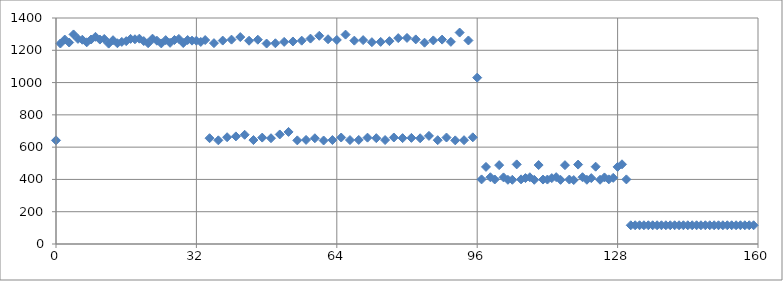
| Category | avg |
|---|---|
| 0.0 | 642.2 |
| 1.0 | 1242 |
| 2.0 | 1266.6 |
| 3.0 | 1248.2 |
| 4.0 | 1298.2 |
| 5.0 | 1270.6 |
| 6.0 | 1265.4 |
| 7.0 | 1249.4 |
| 8.0 | 1266.8 |
| 9.0 | 1283.4 |
| 10.0 | 1266.4 |
| 11.0 | 1270 |
| 12.0 | 1241.4 |
| 13.0 | 1262.4 |
| 14.0 | 1243.6 |
| 15.0 | 1252 |
| 16.0 | 1256.6 |
| 17.0 | 1270.6 |
| 18.0 | 1268.2 |
| 19.0 | 1272 |
| 20.0 | 1257.2 |
| 21.0 | 1243.8 |
| 22.0 | 1272 |
| 23.0 | 1259.4 |
| 24.0 | 1242.6 |
| 25.0 | 1263 |
| 26.0 | 1246.2 |
| 27.0 | 1263.8 |
| 28.0 | 1270.4 |
| 29.0 | 1245 |
| 30.0 | 1263.6 |
| 31.0 | 1259.8 |
| 32.0 | 1259.4 |
| 33.0 | 1251.6 |
| 34.0 | 1263.4 |
| 35.0 | 655.4 |
| 36.0 | 1244.2 |
| 37.0 | 642.2 |
| 38.0 | 1260.2 |
| 39.0 | 661.4 |
| 40.0 | 1266 |
| 41.0 | 666.6 |
| 42.0 | 1282 |
| 43.0 | 676.6 |
| 44.0 | 1259.2 |
| 45.0 | 643.8 |
| 46.0 | 1265.6 |
| 47.0 | 659.2 |
| 48.0 | 1241.8 |
| 49.0 | 655.2 |
| 50.0 | 1243.4 |
| 51.0 | 678.6 |
| 52.0 | 1252 |
| 53.0 | 694.2 |
| 54.0 | 1254.6 |
| 55.0 | 642 |
| 56.0 | 1259.6 |
| 57.0 | 644.8 |
| 58.0 | 1272.4 |
| 59.0 | 655 |
| 60.0 | 1289.8 |
| 61.0 | 641.2 |
| 62.0 | 1268.4 |
| 63.0 | 644 |
| 64.0 | 1264 |
| 65.0 | 659.6 |
| 66.0 | 1297.2 |
| 67.0 | 644 |
| 68.0 | 1259.8 |
| 69.0 | 644.6 |
| 70.0 | 1263 |
| 71.0 | 658.8 |
| 72.0 | 1250.2 |
| 73.0 | 655.6 |
| 74.0 | 1252 |
| 75.0 | 644 |
| 76.0 | 1256.6 |
| 77.0 | 659.8 |
| 78.0 | 1275.4 |
| 79.0 | 655.8 |
| 80.0 | 1276.6 |
| 81.0 | 657.4 |
| 82.0 | 1267.4 |
| 83.0 | 655 |
| 84.0 | 1247 |
| 85.0 | 669.8 |
| 86.0 | 1261.2 |
| 87.0 | 643 |
| 88.0 | 1266.2 |
| 89.0 | 659.6 |
| 90.0 | 1252.2 |
| 91.0 | 642 |
| 92.0 | 1309.8 |
| 93.0 | 643 |
| 94.0 | 1260.8 |
| 95.0 | 660.8 |
| 96.0 | 1030.6 |
| 97.0 | 400.2 |
| 98.0 | 477.6 |
| 99.0 | 413.4 |
| 100.0 | 399.6 |
| 101.0 | 488.6 |
| 102.0 | 412.6 |
| 103.0 | 397.8 |
| 104.0 | 397.8 |
| 105.0 | 493.2 |
| 106.0 | 400.4 |
| 107.0 | 408.4 |
| 108.0 | 413.4 |
| 109.0 | 397.8 |
| 110.0 | 489 |
| 111.0 | 399.2 |
| 112.0 | 399.2 |
| 113.0 | 408.2 |
| 114.0 | 414 |
| 115.0 | 397.4 |
| 116.0 | 488.4 |
| 117.0 | 399.2 |
| 118.0 | 396.2 |
| 119.0 | 492 |
| 120.0 | 413.6 |
| 121.0 | 398 |
| 122.0 | 408.2 |
| 123.0 | 479 |
| 124.0 | 398 |
| 125.0 | 412.4 |
| 126.0 | 400.4 |
| 127.0 | 409.8 |
| 128.0 | 477.8 |
| 129.0 | 493.8 |
| 130.0 | 400.2 |
| 131.0 | 116 |
| 132.0 | 116 |
| 133.0 | 116 |
| 134.0 | 116 |
| 135.0 | 116 |
| 136.0 | 116 |
| 137.0 | 116 |
| 138.0 | 116 |
| 139.0 | 116 |
| 140.0 | 116 |
| 141.0 | 116 |
| 142.0 | 116 |
| 143.0 | 116 |
| 144.0 | 116 |
| 145.0 | 116 |
| 146.0 | 116 |
| 147.0 | 116 |
| 148.0 | 116 |
| 149.0 | 116 |
| 150.0 | 116 |
| 151.0 | 116 |
| 152.0 | 116 |
| 153.0 | 116 |
| 154.0 | 116 |
| 155.0 | 116 |
| 156.0 | 116 |
| 157.0 | 116 |
| 158.0 | 116 |
| 159.0 | 116 |